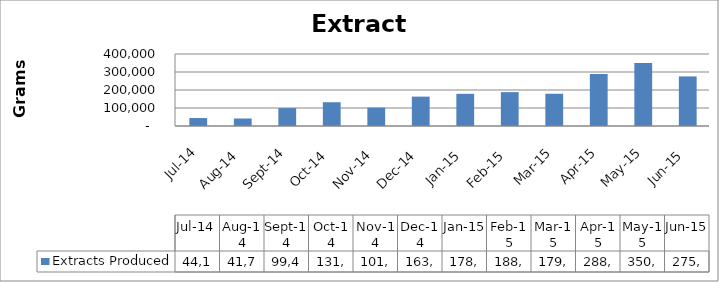
| Category | Extracts Produced |
|---|---|
| 2014-07-01 | 44159.07 |
| 2014-08-01 | 41705.09 |
| 2014-09-01 | 99434.08 |
| 2014-10-01 | 131987.606 |
| 2014-11-01 | 101810.962 |
| 2014-12-01 | 163234.214 |
| 2015-01-01 | 178738.887 |
| 2015-02-01 | 188166.2 |
| 2015-03-01 | 179027.455 |
| 2015-04-01 | 288682.727 |
| 2015-05-01 | 350629.42 |
| 2015-06-01 | 275462.913 |